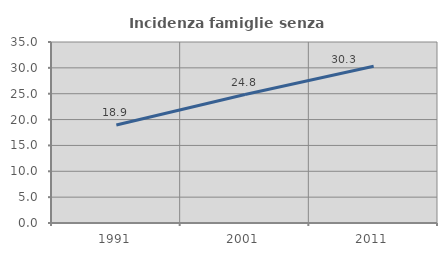
| Category | Incidenza famiglie senza nuclei |
|---|---|
| 1991.0 | 18.94 |
| 2001.0 | 24.84 |
| 2011.0 | 30.323 |